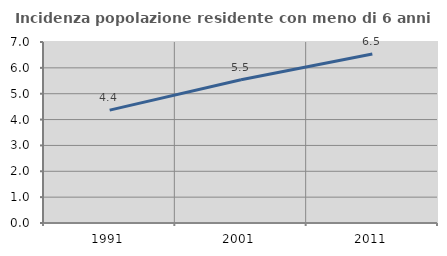
| Category | Incidenza popolazione residente con meno di 6 anni |
|---|---|
| 1991.0 | 4.364 |
| 2001.0 | 5.542 |
| 2011.0 | 6.538 |